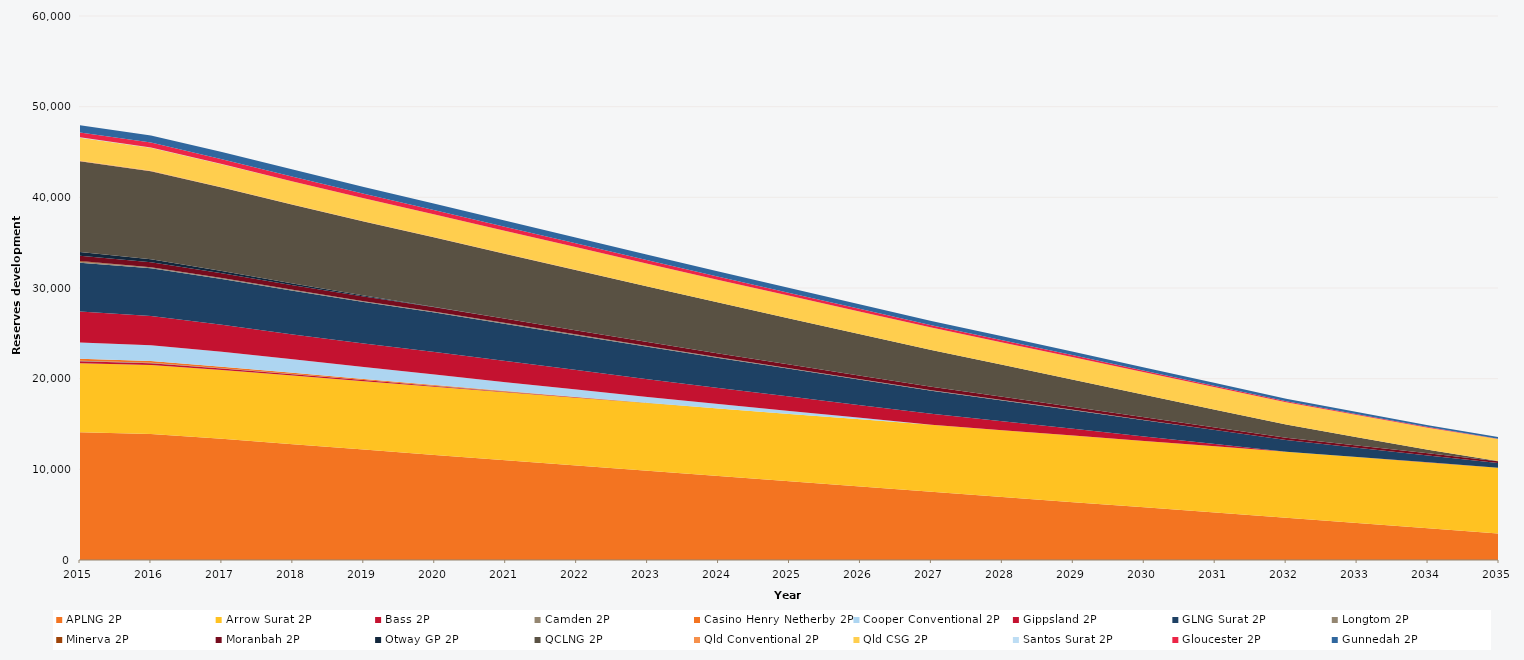
| Category | APLNG 2P | Arrow Surat 2P | Bass 2P | Camden 2P | Casino Henry Netherby 2P | Cooper Conventional 2P | Gippsland 2P | GLNG Surat 2P | Longtom 2P | Minerva 2P | Moranbah 2P | Otway GP 2P | QCLNG 2P | Qld Conventional 2P | Qld CSG 2P | Santos Surat 2P | Gloucester 2P | Gunnedah 2P |
|---|---|---|---|---|---|---|---|---|---|---|---|---|---|---|---|---|---|---|
| 2015.0 | 14091 | 7605.789 | 221.176 | 45 | 225.66 | 1792.804 | 3415.402 | 5391 | 113.032 | 82.809 | 570 | 410.531 | 10028 | 41.53 | 2549.688 | 38.3 | 527 | 798.7 |
| 2016.0 | 13907.74 | 7601.422 | 196.721 | 39.525 | 196.46 | 1750.058 | 3229.174 | 5244.148 | 110.707 | 0 | 553.013 | 335.706 | 9722.602 | 41.53 | 2544.213 | 34.083 | 527 | 798.7 |
| 2017.0 | 13374.968 | 7579.7 | 172.199 | 34.035 | 167.18 | 1649.312 | 2963.398 | 5042.116 | 108.382 | 0 | 535.913 | 260.676 | 9190.116 | 41.53 | 2538.723 | 23.103 | 527 | 798.7 |
| 2018.0 | 12779.288 | 7560.897 | 147.744 | 28.56 | 137.98 | 1486.107 | 2722.307 | 4829.923 | 103.732 | 0 | 519.159 | 185.851 | 8667.478 | 35.272 | 2533.248 | 12.153 | 527 | 798.7 |
| 2019.0 | 12183.608 | 7536.542 | 123.289 | 23.085 | 108.78 | 1321.772 | 2568.464 | 4585.387 | 100.8 | 0 | 502.85 | 111.026 | 8165.055 | 27.242 | 2527.773 | 1.203 | 498.469 | 762.2 |
| 2020.0 | 11587.928 | 7517.547 | 98.834 | 17.61 | 79.58 | 1157.295 | 2490.967 | 4334.57 | 96.15 | 0 | 486.791 | 36.201 | 7659.499 | 23.502 | 2522.298 | 0 | 469.934 | 725.7 |
| 2021.0 | 10990.616 | 7500.114 | 74.312 | 12.12 | 50.3 | 989.577 | 2343.696 | 4080.376 | 93.825 | 0 | 470.435 | 0 | 7150.731 | 23.502 | 2516.808 | 0 | 441.199 | 689.1 |
| 2022.0 | 10415.011 | 7481.332 | 49.857 | 6.645 | 21.1 | 823.232 | 2148.165 | 3825.971 | 91.5 | 0 | 453.19 | 0 | 6641.838 | 15.472 | 2511.333 | 0 | 412.108 | 652.6 |
| 2023.0 | 9839.406 | 7464.609 | 25.402 | 1.17 | 0 | 658.966 | 1959.597 | 3571.566 | 84.6 | 0 | 435.397 | 0 | 6120.05 | 7.442 | 2505.858 | 0 | 383.511 | 616.1 |
| 2024.0 | 9263.801 | 7442.901 | 0.947 | 0 | 0 | 494.855 | 1768.426 | 3317.161 | 80.025 | 0 | 417.467 | 0 | 5603.551 | 0 | 2500.383 | 0 | 354.348 | 579.6 |
| 2025.0 | 8686.619 | 7421.229 | 0 | 0 | 0 | 333.342 | 1583.96 | 3062.059 | 68.55 | 0 | 399.425 | 0 | 5085.742 | 0 | 2494.893 | 0 | 325.422 | 543 |
| 2026.0 | 8111.014 | 7399.538 | 0 | 0 | 0 | 172.131 | 1398.63 | 2807.654 | 57.075 | 0 | 381.151 | 0 | 4569.318 | 0 | 2489.418 | 0 | 296.259 | 506.5 |
| 2027.0 | 7535.409 | 7377.155 | 0 | 0 | 0 | 10.758 | 1200.374 | 2553.249 | 57.075 | 0 | 362.59 | 0 | 4053.15 | 0 | 2483.943 | 0 | 267.255 | 470 |
| 2028.0 | 6959.804 | 7362.521 | 0 | 0 | 0 | 0.28 | 974.239 | 2298.844 | 52.65 | 0 | 343.781 | 0 | 3529.448 | 0 | 2478.468 | 0 | 238.092 | 433.5 |
| 2029.0 | 6382.622 | 7350.169 | 0 | 0 | 0 | 0 | 749.716 | 2043.742 | 36.6 | 0 | 324.479 | 0 | 3001.054 | 0 | 2472.978 | 0 | 208.848 | 396.9 |
| 2030.0 | 5807.017 | 7328.365 | 0 | 0 | 0 | 0 | 494.47 | 1789.337 | 29.775 | 0 | 304.567 | 0 | 2481.882 | 0 | 2467.503 | 0 | 179.67 | 360.4 |
| 2031.0 | 5231.412 | 7313.007 | 0 | 0 | 0 | 0 | 245.451 | 1534.932 | 13.725 | 0 | 284.156 | 0 | 1957.559 | 0 | 2462.028 | 0 | 150.491 | 323.9 |
| 2032.0 | 4655.807 | 7294.991 | 0 | 0 | 0 | 0 | 0.618 | 1280.527 | 0 | 0 | 263.588 | 0 | 1437.494 | 0 | 2456.553 | 0 | 121.312 | 287.4 |
| 2033.0 | 4078.625 | 7278.83 | 0 | 0 | 0 | 0 | 0.618 | 1025.425 | 0 | 0 | 242.801 | 0 | 914.183 | 0 | 2451.063 | 0 | 92.053 | 250.8 |
| 2034.0 | 3503.02 | 7264.016 | 0 | 0 | 0 | 0 | 0.618 | 771.02 | 0 | 0 | 221.926 | 0 | 390.457 | 0 | 2445.588 | 0 | 62.869 | 214.3 |
| 2035.0 | 2927.415 | 7246.436 | 0 | 0 | 0 | 0 | 0.618 | 516.615 | 0 | 0 | 200.836 | 0 | 0 | 0 | 2440.113 | 0 | 33.69 | 177.8 |